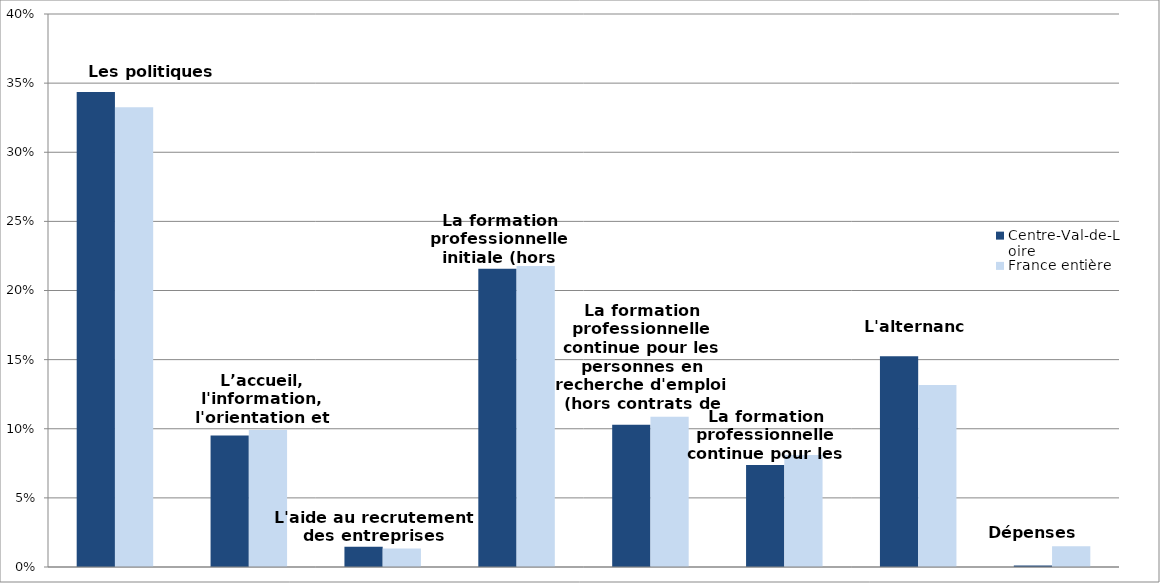
| Category | Centre-Val-de-Loire | France entière |
|---|---|---|
| Les politiques d'emploi | 0.344 | 0.333 |
| L’accueil, l'information, l'orientation et l'accompagnement | 0.095 | 0.099 |
| L'aide au recrutement des entreprises | 0.015 | 0.013 |
| La formation professionnelle initiale (hors apprentissage) | 0.216 | 0.218 |
| La formation professionnelle continue pour les personnes en recherche d'emploi (hors contrats de professionnalisation) | 0.103 | 0.109 |
| La formation professionnelle continue pour les actifs occupés | 0.074 | 0.081 |
| L'alternance | 0.152 | 0.132 |
| Dépenses non-ventilables | 0.001 | 0.015 |